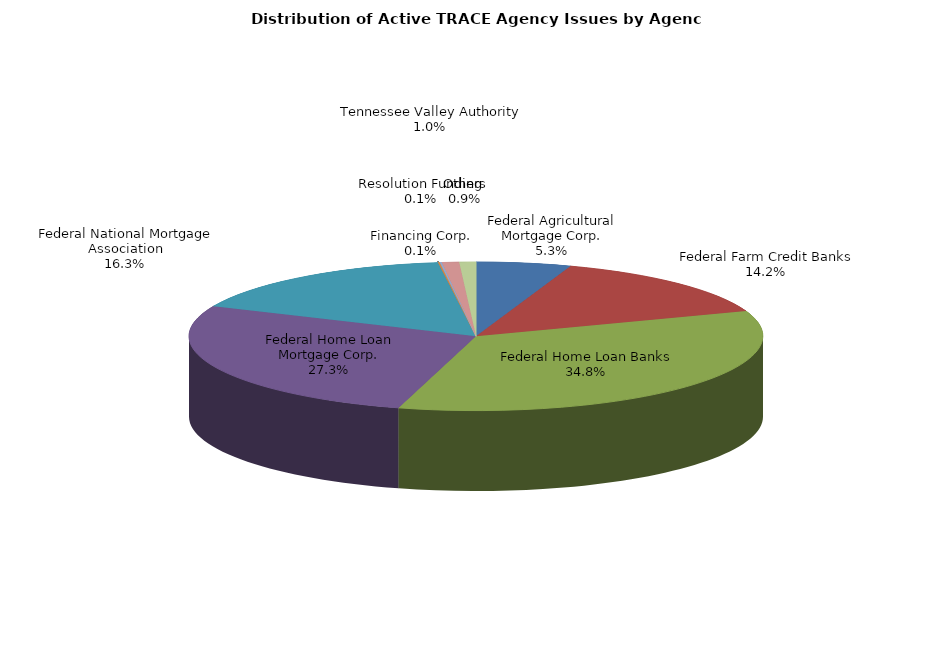
| Category | Series 0 |
|---|---|
| Federal Agricultural Mortgage Corp. | 2634 |
| Federal Farm Credit Banks | 7004 |
| Federal Home Loan Banks | 17221 |
| Federal Home Loan Mortgage Corp. | 13491 |
| Federal National Mortgage Association | 8036 |
| Financing Corp. | 45 |
| Resolution Funding | 59 |
| Tennessee Valley Authority | 478 |
| Others | 461 |